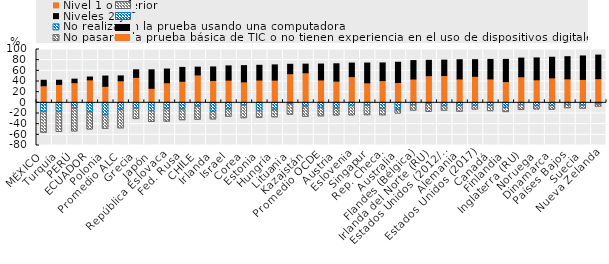
| Category | Nivel 1 o inferior | Niveles 2 y 3 | No realizaron la prueba usando una computadora | No pasaron la prueba básica de TIC o no tienen experiencia en el uso de dispositivos digitales |
|---|---|---|---|---|
| MÉXICO | 32.088 | 10.214 | -17.819 | -39.255 |
| Turquía | 34.573 | 7.792 | -17.661 | -37.97 |
| PERÚ | 37.827 | 6.611 | -11.103 | -43.564 |
| ECUADOR | 43.147 | 5.24 | -18.128 | -32.928 |
| Polonia | 31.018 | 19.205 | -23.783 | -25.974 |
| Promedio ALC  | 41.357 | 9.154 | -13.633 | -35.236 |
| Grecia | 47.888 | 14.003 | -11.224 | -20.214 |
| Japón | 27.315 | 34.585 | -15.909 | -20.935 |
| República Eslovaca | 37.712 | 25.629 | -12.201 | -24.177 |
| Fed. Rusa | 40.48 | 25.935 | -12.801 | -20.784 |
| CHILE | 52.365 | 14.551 | -7.483 | -25.199 |
| Irlanda | 42.011 | 25.291 | -17.417 | -14.729 |
| Israel | 42.659 | 26.625 | -12.707 | -14.344 |
| Corea | 39.352 | 30.409 | -5.393 | -24.578 |
| Estonia | 42.806 | 27.555 | -15.794 | -13.338 |
| Hungría | 42.639 | 28.491 | -13.738 | -14.416 |
| Lituania | 54.633 | 17.621 | -2.344 | -20.899 |
| Kazajstán | 56.384 | 16.154 | -7.469 | -19.675 |
| Promedio OCDE | 42.955 | 29.745 | -10.011 | -16.34 |
| Austria | 40.758 | 32.468 | -11.252 | -13.671 |
| Eslovenia | 49.173 | 25.356 | -6.313 | -18.403 |
| Singapur | 37.532 | 37.029 | -5.53 | -18.857 |
| Rep. Checa. | 41.672 | 33.144 | -12.051 | -12.497 |
| Australia | 38.08 | 37.97 | -13.714 | -7.496 |
| Flandes (Bélgica) | 44.691 | 34.51 | -4.688 | -10.901 |
| Irlanda del Norte (RU) | 50.969 | 28.732 | -2.271 | -15.817 |
| Estados Unidos (2012/2014) | 51.198 | 28.896 | -6.62 | -9.174 |
| Alemania | 44.833 | 35.976 | -6.051 | -11.607 |
| Estados Unidos (2017) | 49.769 | 31.151 | -6.286 | -7.42 |
| Canadá | 44.827 | 36.557 | -6.302 | -10.378 |
| Finlandia | 39.882 | 41.561 | -9.72 | -8.712 |
| Inglaterra (RU) | 48.913 | 34.978 | -4.562 | -9.934 |
| Noruega | 43.266 | 40.98 | -6.655 | -6.853 |
| Dinamarca | 46.806 | 38.672 | -6.363 | -7.768 |
| Países Bajos | 45.024 | 41.534 | -4.492 | -6.657 |
| Suecia | 43.909 | 43.98 | -5.662 | -6.351 |
| Nueva Zelanda | 45.337 | 44.188 | -3.41 | -4.922 |